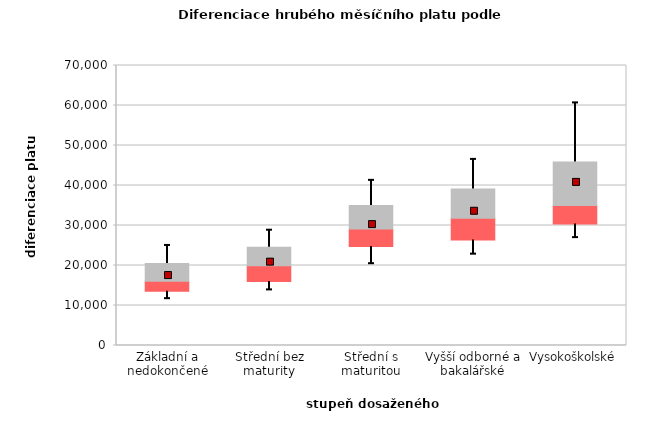
| Category | 0.25 | 0.5 | 0.75 |
|---|---|---|---|
| Základní a nedokončené | 13549.33 | 2502.67 | 4450.823 |
| Střední bez maturity | 16009.705 | 3937.708 | 4641.989 |
| Střední s maturitou | 24723.361 | 4375.014 | 5929.765 |
| Vyšší odborné a bakalářské | 26370.189 | 5471.323 | 7278.007 |
| Vysokoškolské | 30402.068 | 4577.74 | 10897.741 |